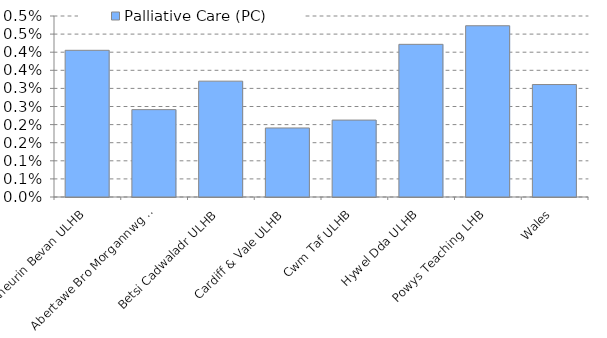
| Category | Palliative Care (PC) |
|---|---|
| Aneurin Bevan ULHB | 0.004 |
| Abertawe Bro Morgannwg ULHB | 0.002 |
| Betsi Cadwaladr ULHB | 0.003 |
| Cardiff & Vale ULHB | 0.002 |
| Cwm Taf ULHB | 0.002 |
| Hywel Dda ULHB | 0.004 |
| Powys Teaching LHB | 0.005 |
| Wales | 0.003 |